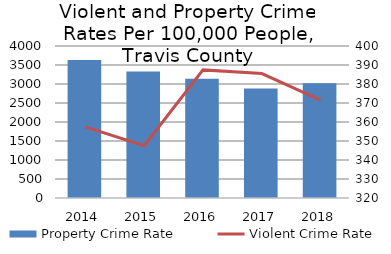
| Category | Property Crime Rate      |
|---|---|
| 2014.0 | 3630.894 |
| 2015.0 | 3329.093 |
| 2016.0 | 3138.737 |
| 2017.0 | 2884.651 |
| 2018.0 | 3022.932 |